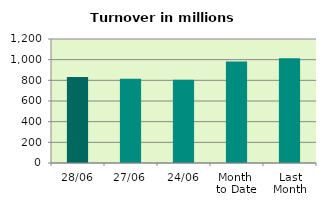
| Category | Series 0 |
|---|---|
| 28/06 | 832.284 |
| 27/06 | 814.496 |
| 24/06 | 805.052 |
| Month 
to Date | 981.677 |
| Last
Month | 1012.592 |